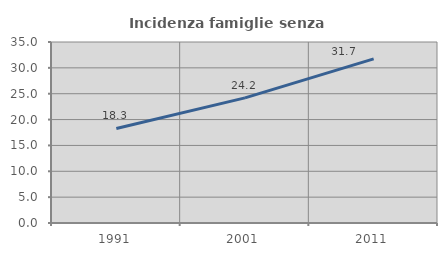
| Category | Incidenza famiglie senza nuclei |
|---|---|
| 1991.0 | 18.288 |
| 2001.0 | 24.191 |
| 2011.0 | 31.747 |